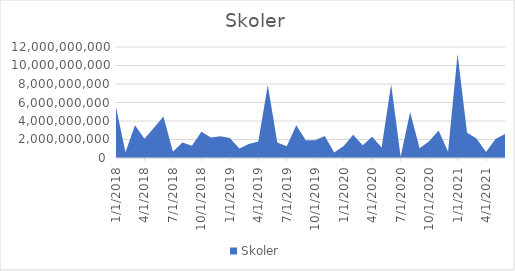
| Category | Skoler |
|---|---|
| 1/1/18 | 5496860000 |
| 2/1/18 | 619250000 |
| 3/1/18 | 3535025000 |
| 4/1/18 | 2081600000 |
| 5/1/18 | 3269630000 |
| 6/1/18 | 4475020000 |
| 7/1/18 | 673740000 |
| 8/1/18 | 1687450000 |
| 9/1/18 | 1325230000 |
| 10/1/18 | 2849900000 |
| 11/1/18 | 2218100000 |
| 12/1/18 | 2357200000 |
| 1/1/19 | 2153200000 |
| 2/1/19 | 1022950000 |
| 3/1/19 | 1506800000 |
| 4/1/19 | 1785200000 |
| 5/1/19 | 7896575000 |
| 6/1/19 | 1676000000 |
| 7/1/19 | 1269500000 |
| 8/1/19 | 3531000000 |
| 9/1/19 | 1924500000 |
| 10/1/19 | 1922000000 |
| 11/1/19 | 2374550000 |
| 12/1/19 | 585500000 |
| 1/1/20 | 1300500000 |
| 2/1/20 | 2524950000 |
| 3/1/20 | 1368000000 |
| 4/1/20 | 2310500000 |
| 5/1/20 | 1127500000 |
| 6/1/20 | 7976000000 |
| 7/1/20 | 146900000 |
| 8/1/20 | 4976800000 |
| 9/1/20 | 1061800000 |
| 10/1/20 | 1821700000 |
| 11/1/20 | 2978850000 |
| 12/1/20 | 689000000 |
| 1/1/21 | 11237800000 |
| 2/1/21 | 2719850000 |
| 3/1/21 | 2101500000 |
| 4/1/21 | 654500000 |
| 5/1/21 | 2054150000 |
| 6/1/21 | 2596700000 |